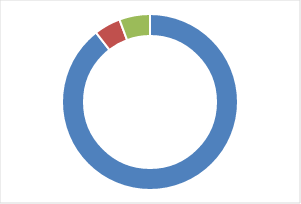
| Category | Series 0 |
|---|---|
| 0 | 0.89 |
| 1 | 0.049 |
| 2 | 0.056 |